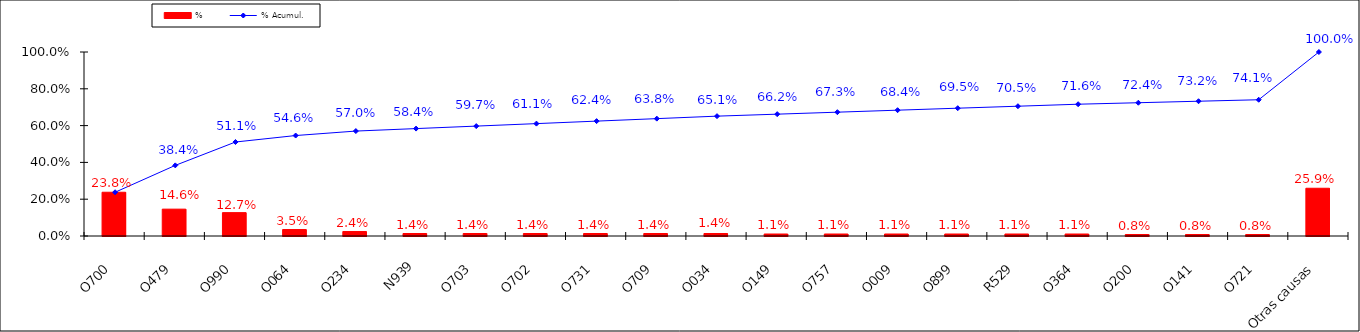
| Category | % |
|---|---|
| O700 | 0.238 |
| O479 | 0.146 |
| O990 | 0.127 |
| O064 | 0.035 |
| O234 | 0.024 |
| N939 | 0.014 |
| O703 | 0.014 |
| O702 | 0.014 |
| O731 | 0.014 |
| O709 | 0.014 |
| O034 | 0.014 |
| O149 | 0.011 |
| O757 | 0.011 |
| O009 | 0.011 |
| O899 | 0.011 |
| R529 | 0.011 |
| O364 | 0.011 |
| O200 | 0.008 |
| O141 | 0.008 |
| O721 | 0.008 |
| Otras causas | 0.259 |